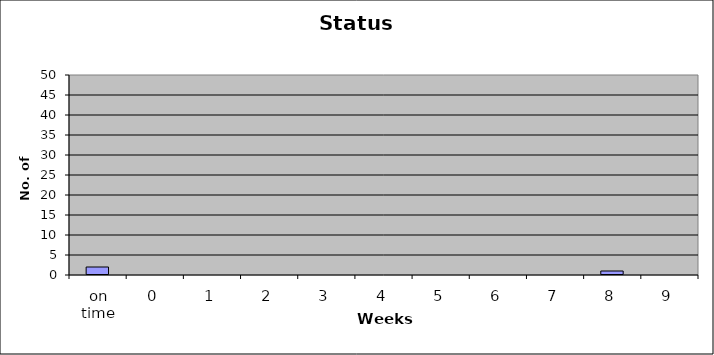
| Category | Series 0 |
|---|---|
| on time | 2 |
| 0 | 0 |
| 1 | 0 |
| 2 | 0 |
| 3 | 0 |
| 4 | 0 |
| 5 | 0 |
| 6 | 0 |
| 7 | 0 |
| 8 | 1 |
| 9 | 0 |